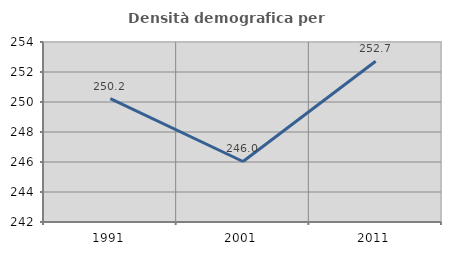
| Category | Densità demografica |
|---|---|
| 1991.0 | 250.223 |
| 2001.0 | 246.035 |
| 2011.0 | 252.718 |